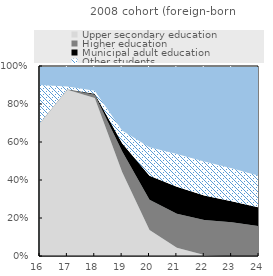
| Category | Upper secondary education | Higher education | Municipal adult education | Other students | Non-students |
|---|---|---|---|---|---|
| 16.0 | 7065 | 0 | 14 | 1999 | 1016 |
| 17.0 | 9876 | 8 | 18 | 169 | 1210 |
| 18.0 | 10248 | 200 | 72 | 184 | 1611 |
| 19.0 | 5900 | 1458 | 566 | 899 | 4531 |
| 20.0 | 1994 | 2333 | 1845 | 2182 | 6247 |
| 21.0 | 694 | 2878 | 2285 | 2766 | 7420 |
| 22.0 | 88 | 3374 | 2361 | 3267 | 9209 |
| 23.0 | 10 | 3739 | 2326 | 3656 | 11317 |
| 24.0 | 1 | 3932 | 2433 | 4173 | 14410 |